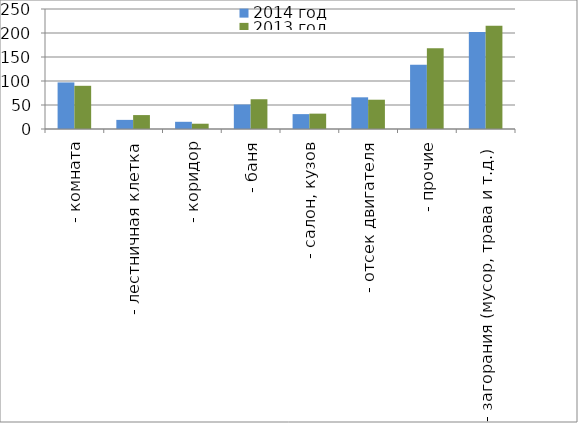
| Category | 2014 год | 2013 год |
|---|---|---|
|  - комната | 97 | 90 |
|  - лестничная клетка | 19 | 29 |
|  - коридор | 15 | 11 |
|  - баня | 51 | 62 |
|  - салон, кузов | 31 | 32 |
|  - отсек двигателя | 66 | 61 |
| - прочие | 134 | 168 |
| - загорания (мусор, трава и т.д.)  | 202 | 215 |